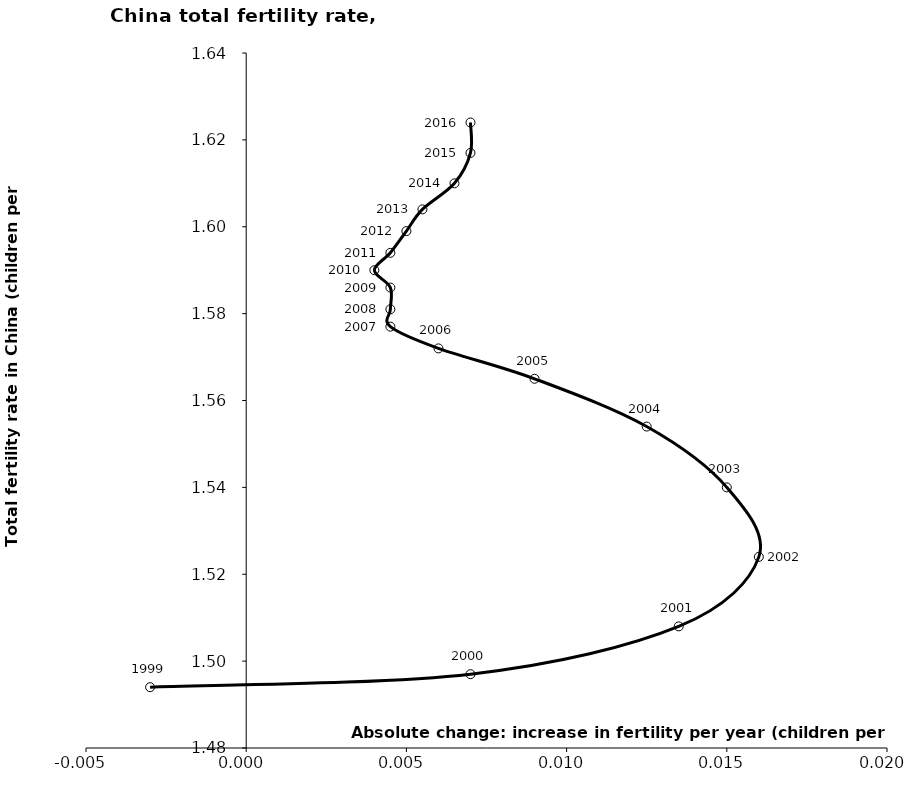
| Category | Series 0 |
|---|---|
| -0.0029999999999998916 | 1.494 |
| 0.007000000000000006 | 1.497 |
| 0.013499999999999956 | 1.508 |
| 0.016000000000000014 | 1.524 |
| 0.015000000000000013 | 1.54 |
| 0.012499999999999956 | 1.554 |
| 0.009000000000000008 | 1.565 |
| 0.006000000000000005 | 1.572 |
| 0.0044999999999999485 | 1.577 |
| 0.0045000000000000595 | 1.581 |
| 0.0045000000000000595 | 1.586 |
| 0.0040000000000000036 | 1.59 |
| 0.0044999999999999485 | 1.594 |
| 0.0050000000000000044 | 1.599 |
| 0.00550000000000006 | 1.604 |
| 0.00649999999999995 | 1.61 |
| 0.007000000000000006 | 1.617 |
| 0.007000000000000117 | 1.624 |